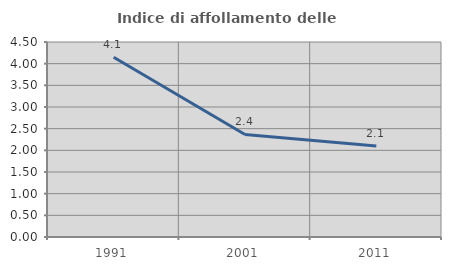
| Category | Indice di affollamento delle abitazioni  |
|---|---|
| 1991.0 | 4.15 |
| 2001.0 | 2.367 |
| 2011.0 | 2.102 |